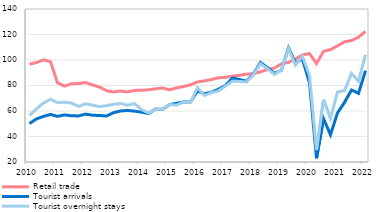
| Category | Retail trade  | Tourist arrivals  | Tourist overnight stays  |
|---|---|---|---|
| 2010 | 96.722 | 50.141 | 56.486 |
| II | 97.998 | 53.823 | 61.752 |
| III | 100.074 | 55.772 | 66.19 |
| IV | 98.748 | 57.333 | 69.262 |
| 2011 | 82.137 | 55.783 | 66.471 |
| II | 79.522 | 56.955 | 66.984 |
| III | 81.383 | 56.229 | 66.2 |
| IV | 81.584 | 56.138 | 63.598 |
| 2012 | 82.344 | 57.543 | 65.665 |
| II | 80.405 | 56.677 | 64.601 |
| III | 78.742 | 56.472 | 63.428 |
| IV | 75.967 | 56.08 | 64.195 |
| 2013 | 74.883 | 58.685 | 65.258 |
| II | 75.678 | 60.018 | 65.889 |
| III | 74.975 | 60.399 | 64.515 |
| IV | 76.153 | 59.906 | 65.798 |
| 2014 | 76.286 | 59.103 | 61.115 |
| II | 76.628 | 57.957 | 58.337 |
| III | 77.399 | 61.483 | 61.322 |
| IV | 78.038 | 61.37 | 61.286 |
| 2015 | 76.572 | 64.939 | 65.022 |
| II | 78.122 | 66.035 | 64.574 |
| III | 79.165 | 67.006 | 67.127 |
| IV | 80.55 | 67.142 | 66.88 |
| 2016 | 82.814 | 75.712 | 78.153 |
| II | 83.601 | 73.464 | 72.163 |
| III | 84.718 | 74.774 | 74.447 |
| IV | 86.021 | 77.041 | 75.787 |
| 2017 | 86.402 | 80.077 | 79.629 |
| II | 87.354 | 85.878 | 83.399 |
| III | 88.076 | 84.703 | 83.181 |
| IV | 88.833 | 83.371 | 82.763 |
| 2018 | 89.388 | 89.073 | 88.614 |
| II | 90.713 | 98.055 | 97.064 |
| III | 92.614 | 93.946 | 93.077 |
| IV | 93.685 | 89.462 | 88.59 |
| 2019 | 97.056 | 92.075 | 92.213 |
| II | 98.068 | 109.514 | 108.823 |
| III | 100.856 | 97.769 | 96.058 |
| IV | 104.02 | 100.642 | 102.906 |
| 2020 | 105.052 | 82.139 | 87.813 |
| II | 97.2 | 22.876 | 29.346 |
| III | 106.759 | 53.943 | 68.934 |
| IV | 108.124 | 41.445 | 54.297 |
| 2021 | 111.078 | 58.569 | 74.876 |
| II | 114.271 | 66.786 | 75.992 |
| III | 115.283 | 76.527 | 89.478 |
| IV | 117.911 | 73.774 | 83.402 |
| 2022 | 122.475 | 91.693 | 104.126 |